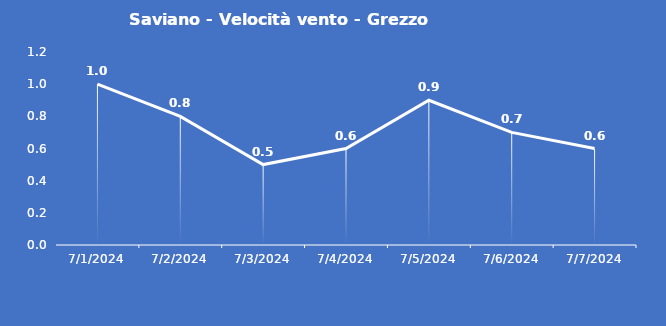
| Category | Saviano - Velocità vento - Grezzo (m/s) |
|---|---|
| 7/1/24 | 1 |
| 7/2/24 | 0.8 |
| 7/3/24 | 0.5 |
| 7/4/24 | 0.6 |
| 7/5/24 | 0.9 |
| 7/6/24 | 0.7 |
| 7/7/24 | 0.6 |